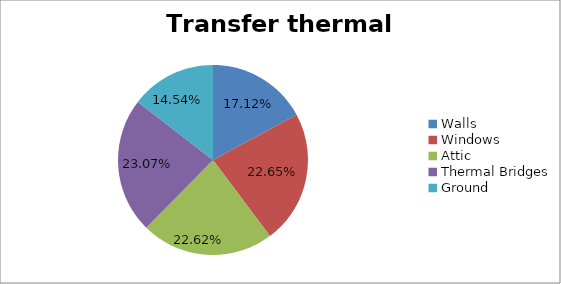
| Category | Series 0 |
|---|---|
| Walls | 0.171 |
| Windows | 0.227 |
| Attic | 0.226 |
| Thermal Bridges | 0.231 |
| Ground | 0.145 |